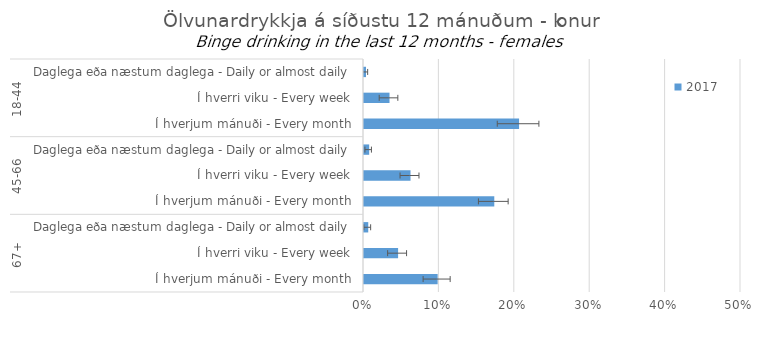
| Category | 2017 |
|---|---|
| 0 | 0.003 |
| 1 | 0.034 |
| 2 | 0.206 |
| 3 | 0.007 |
| 4 | 0.062 |
| 5 | 0.173 |
| 6 | 0.006 |
| 7 | 0.045 |
| 8 | 0.098 |